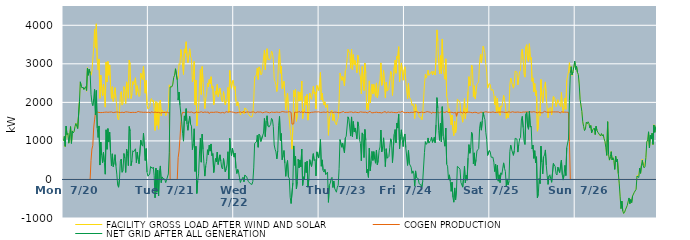
| Category | FACILITY GROSS LOAD AFTER WIND AND SOLAR | COGEN PRODUCTION | NET GRID AFTER ALL GENERATION |
|---|---|---|---|
|  Mon  7/20 | 998 | 0 | 1005 |
|  Mon  7/20 | 1118 | 0 | 1118 |
|  Mon  7/20 | 846 | 0 | 858 |
|  Mon  7/20 | 1331 | 0 | 1385 |
|  Mon  7/20 | 1161 | 0 | 1161 |
|  Mon  7/20 | 1197 | 0 | 1197 |
|  Mon  7/20 | 941 | 0 | 941 |
|  Mon  7/20 | 1137 | 0 | 1148 |
|  Mon  7/20 | 1372 | 0 | 1372 |
|  Mon  7/20 | 946 | 0 | 936 |
|  Mon  7/20 | 1258 | 0 | 1258 |
|  Mon  7/20 | 1210 | 0 | 1210 |
|  Mon  7/20 | 1243 | 0 | 1243 |
|  Mon  7/20 | 1370 | 0 | 1373 |
|  Mon  7/20 | 1465 | 0 | 1453 |
|  Mon  7/20 | 1448 | 0 | 1438 |
|  Mon  7/20 | 1326 | 0 | 1320 |
|  Mon  7/20 | 1316 | 0 | 1316 |
|  Mon  7/20 | 2018 | 0 | 2011 |
|  Mon  7/20 | 2528 | 0 | 2533 |
|  Mon  7/20 | 2423 | 0 | 2423 |
|  Mon  7/20 | 2381 | 0 | 2371 |
|  Mon  7/20 | 2398 | 0 | 2398 |
|  Mon  7/20 | 2338 | 0 | 2332 |
|  Mon  7/20 | 2364 | 0 | 2351 |
|  Mon  7/20 | 2409 | 0 | 2407 |
|  Mon  7/20 | 2288 | 0 | 2306 |
|  Mon  7/20 | 2899 | 0 | 2888 |
|  Mon  7/20 | 2703 | 0 | 2703 |
|  Mon  7/20 | 2860 | 0 | 2860 |
|  Mon  7/20 | 2764 | 0 | 2764 |
|  Mon  7/20 | 2703 | 491 | 2212 |
|  Mon  7/20 | 2797 | 788 | 1990 |
|  Mon  7/20 | 2812 | 880 | 1914 |
|  Mon  7/20 | 3420 | 1336 | 2084 |
|  Mon  7/20 | 3893 | 1545 | 2339 |
|  Mon  7/20 | 3408 | 1736 | 1672 |
|  Mon  7/20 | 4037 | 1729 | 2308 |
|  Mon  7/20 | 3083 | 1748 | 1335 |
|  Mon  7/20 | 2839 | 1750 | 1089 |
|  Mon  7/20 | 3126 | 1738 | 1388 |
|  Mon  7/20 | 2104 | 1730 | 374 |
|  Mon  7/20 | 2706 | 1735 | 971 |
|  Mon  7/20 | 2366 | 1742 | 624 |
|  Mon  7/20 | 2170 | 1737 | 433 |
|  Mon  7/20 | 2467 | 1747 | 703 |
|  Mon  7/20 | 2193 | 1742 | 451 |
|  Mon  7/20 | 1876 | 1740 | 136 |
|  Mon  7/20 | 3048 | 1748 | 1288 |
|  Mon  7/20 | 2528 | 1746 | 782 |
|  Mon  7/20 | 3062 | 1742 | 1320 |
|  Mon  7/20 | 2702 | 1732 | 970 |
|  Mon  7/20 | 2971 | 1746 | 1225 |
|  Mon  7/20 | 2433 | 1736 | 697 |
|  Mon  7/20 | 2102 | 1751 | 351 |
|  Mon  7/20 | 2406 | 1741 | 665 |
|  Mon  7/20 | 2026 | 1735 | 332 |
|  Mon  7/20 | 2190 | 1748 | 442 |
|  Mon  7/20 | 2382 | 1744 | 643 |
|  Mon  7/20 | 2103 | 1747 | 356 |
|  Mon  7/20 | 1888 | 1750 | 138 |
|  Mon  7/20 | 1587 | 1732 | -145 |
|  Mon  7/20 | 1542 | 1744 | -202 |
|  Mon  7/20 | 1724 | 1727 | -3 |
|  Mon  7/20 | 2209 | 1736 | 473 |
|  Mon  7/20 | 2277 | 1747 | 530 |
|  Mon  7/20 | 1929 | 1744 | 186 |
|  Mon  7/20 | 1974 | 1752 | 222 |
|  Mon  7/20 | 2408 | 1735 | 673 |
|  Mon  7/20 | 2279 | 1734 | 549 |
|  Mon  7/20 | 1967 | 1754 | 182 |
|  Mon  7/20 | 2532 | 1746 | 786 |
|  Mon  7/20 | 2413 | 1750 | 680 |
|  Mon  7/20 | 2107 | 1748 | 359 |
|  Mon  7/20 | 3096 | 1742 | 1373 |
|  Mon  7/20 | 2990 | 1736 | 1254 |
|  Mon  7/20 | 2098 | 1736 | 356 |
|  Mon  7/20 | 2221 | 1734 | 487 |
|  Mon  7/20 | 2540 | 1742 | 745 |
|  Mon  7/20 | 2463 | 1745 | 718 |
|  Mon  7/20 | 2459 | 1738 | 721 |
|  Mon  7/20 | 2639 | 1733 | 796 |
|  Mon  7/20 | 2188 | 1740 | 432 |
|  Mon  7/20 | 2432 | 1744 | 709 |
|  Mon  7/20 | 2281 | 1764 | 533 |
|  Mon  7/20 | 2149 | 1741 | 408 |
|  Mon  7/20 | 2183 | 1750 | 433 |
|  Mon  7/20 | 2756 | 1737 | 1019 |
|  Mon  7/20 | 2649 | 1747 | 902 |
|  Mon  7/20 | 2587 | 1742 | 864 |
|  Mon  7/20 | 2935 | 1741 | 1203 |
|  Mon  7/20 | 2950 | 1758 | 1209 |
|  Mon  7/20 | 2237 | 1745 | 492 |
|  Mon  7/20 | 2571 | 1747 | 802 |
|  Mon  7/20 | 1931 | 1740 | 191 |
|  Mon  7/20 | 1825 | 1741 | 84 |
|  Tue  7/21 | 1837 | 1745 | 92 |
|  Tue  7/21 | 1883 | 1757 | 141 |
|  Tue  7/21 | 2064 | 1724 | 335 |
|  Tue  7/21 | 2101 | 1758 | 359 |
|  Tue  7/21 | 2020 | 1733 | 287 |
|  Tue  7/21 | 2057 | 1737 | 320 |
|  Tue  7/21 | 1849 | 1739 | 110 |
|  Tue  7/21 | 1271 | 1747 | -476 |
|  Tue  7/21 | 2020 | 1742 | 294 |
|  Tue  7/21 | 1403 | 1739 | -333 |
|  Tue  7/21 | 1989 | 1754 | 243 |
|  Tue  7/21 | 1305 | 1740 | -429 |
|  Tue  7/21 | 1984 | 1755 | 229 |
|  Tue  7/21 | 2060 | 1724 | 351 |
|  Tue  7/21 | 1652 | 1733 | -81 |
|  Tue  7/21 | 1803 | 1737 | 66 |
|  Tue  7/21 | 1769 | 1741 | 28 |
|  Tue  7/21 | 1729 | 1735 | 5 |
|  Tue  7/21 | 1767 | 1752 | 4 |
|  Tue  7/21 | 1654 | 1741 | -82 |
|  Tue  7/21 | 1725 | 1732 | -7 |
|  Tue  7/21 | 1739 | 1750 | -10 |
|  Tue  7/21 | 1844 | 1721 | 142 |
|  Tue  7/21 | 2454 | 1749 | 695 |
|  Tue  7/21 | 2400 | 0 | 2400 |
|  Tue  7/21 | 2420 | 0 | 2413 |
|  Tue  7/21 | 2405 | 0 | 2405 |
|  Tue  7/21 | 2473 | 0 | 2473 |
|  Tue  7/21 | 2648 | 0 | 2648 |
|  Tue  7/21 | 2695 | 0 | 2704 |
|  Tue  7/21 | 2872 | 0 | 2872 |
|  Tue  7/21 | 2868 | 0 | 2868 |
|  Tue  7/21 | 2584 | 0 | 2584 |
|  Tue  7/21 | 2625 | 567 | 2058 |
|  Tue  7/21 | 3005 | 737 | 2268 |
|  Tue  7/21 | 2976 | 1041 | 1935 |
|  Tue  7/21 | 3372 | 1435 | 1936 |
|  Tue  7/21 | 3186 | 1675 | 1493 |
|  Tue  7/21 | 2941 | 1742 | 1199 |
|  Tue  7/21 | 2722 | 1729 | 993 |
|  Tue  7/21 | 3386 | 1737 | 1649 |
|  Tue  7/21 | 3276 | 1747 | 1529 |
|  Tue  7/21 | 3572 | 1730 | 1837 |
|  Tue  7/21 | 3180 | 1735 | 1437 |
|  Tue  7/21 | 3029 | 1753 | 1276 |
|  Tue  7/21 | 3252 | 1743 | 1509 |
|  Tue  7/21 | 3391 | 1741 | 1637 |
|  Tue  7/21 | 3183 | 1754 | 1429 |
|  Tue  7/21 | 3133 | 1751 | 1382 |
|  Tue  7/21 | 2536 | 1758 | 775 |
|  Tue  7/21 | 2664 | 1730 | 934 |
|  Tue  7/21 | 3061 | 1749 | 1315 |
|  Tue  7/21 | 1931 | 1724 | 207 |
|  Tue  7/21 | 2576 | 1753 | 860 |
|  Tue  7/21 | 1388 | 1756 | -364 |
|  Tue  7/21 | 1702 | 1740 | -38 |
|  Tue  7/21 | 1871 | 1726 | 145 |
|  Tue  7/21 | 2426 | 1741 | 685 |
|  Tue  7/21 | 2850 | 1733 | 1075 |
|  Tue  7/21 | 2204 | 1756 | 448 |
|  Tue  7/21 | 2929 | 1733 | 1175 |
|  Tue  7/21 | 2529 | 1737 | 780 |
|  Tue  7/21 | 2154 | 1735 | 411 |
|  Tue  7/21 | 1837 | 1750 | 87 |
|  Tue  7/21 | 2091 | 1737 | 354 |
|  Tue  7/21 | 2211 | 1743 | 468 |
|  Tue  7/21 | 2502 | 1731 | 771 |
|  Tue  7/21 | 2402 | 1750 | 639 |
|  Tue  7/21 | 2598 | 1710 | 888 |
|  Tue  7/21 | 2477 | 1742 | 735 |
|  Tue  7/21 | 2665 | 1744 | 921 |
|  Tue  7/21 | 2366 | 1743 | 619 |
|  Tue  7/21 | 2418 | 1761 | 670 |
|  Tue  7/21 | 1940 | 1740 | 180 |
|  Tue  7/21 | 2115 | 1749 | 366 |
|  Tue  7/21 | 2292 | 1748 | 544 |
|  Tue  7/21 | 2206 | 1733 | 456 |
|  Tue  7/21 | 2466 | 1748 | 711 |
|  Tue  7/21 | 2147 | 1742 | 388 |
|  Tue  7/21 | 2147 | 1736 | 411 |
|  Tue  7/21 | 2371 | 1732 | 639 |
|  Tue  7/21 | 2202 | 1726 | 476 |
|  Tue  7/21 | 2055 | 1739 | 304 |
|  Tue  7/21 | 2011 | 1740 | 271 |
|  Tue  7/21 | 2279 | 1743 | 543 |
|  Tue  7/21 | 2255 | 1724 | 522 |
|  Tue  7/21 | 1937 | 1738 | 199 |
|  Tue  7/21 | 2036 | 1757 | 279 |
|  Tue  7/21 | 2108 | 1749 | 397 |
|  Tue  7/21 | 2388 | 1745 | 719 |
|  Tue  7/21 | 1737 | 1744 | -7 |
|  Tue  7/21 | 2825 | 1758 | 1067 |
|  Tue  7/21 | 2500 | 1742 | 758 |
|  Tue  7/21 | 2367 | 1752 | 615 |
|  Tue  7/21 | 2551 | 1742 | 809 |
|  Tue  7/21 | 2579 | 1745 | 834 |
|  Wed  7/22 | 2337 | 1757 | 580 |
|  Wed  7/22 | 2412 | 1728 | 684 |
|  Wed  7/22 | 2033 | 1735 | 298 |
|  Wed  7/22 | 1906 | 1730 | 154 |
|  Wed  7/22 | 2015 | 1752 | 258 |
|  Wed  7/22 | 1923 | 1741 | 182 |
|  Wed  7/22 | 1786 | 1743 | 43 |
|  Wed  7/22 | 1671 | 1751 | -80 |
|  Wed  7/22 | 1729 | 1742 | -17 |
|  Wed  7/22 | 1715 | 1734 | -19 |
|  Wed  7/22 | 1776 | 1735 | 60 |
|  Wed  7/22 | 1703 | 1764 | -60 |
|  Wed  7/22 | 1852 | 1734 | 112 |
|  Wed  7/22 | 1860 | 1744 | 116 |
|  Wed  7/22 | 1822 | 1748 | 74 |
|  Wed  7/22 | 1766 | 1768 | -2 |
|  Wed  7/22 | 1698 | 1751 | -53 |
|  Wed  7/22 | 1709 | 1749 | -47 |
|  Wed  7/22 | 1633 | 1740 | -107 |
|  Wed  7/22 | 1624 | 1744 | -120 |
|  Wed  7/22 | 1619 | 1749 | -130 |
|  Wed  7/22 | 1700 | 1749 | -49 |
|  Wed  7/22 | 2058 | 1753 | 300 |
|  Wed  7/22 | 2664 | 1732 | 936 |
|  Wed  7/22 | 2677 | 1729 | 946 |
|  Wed  7/22 | 2700 | 1727 | 973 |
|  Wed  7/22 | 2893 | 1752 | 1146 |
|  Wed  7/22 | 2595 | 1743 | 835 |
|  Wed  7/22 | 2921 | 1747 | 1177 |
|  Wed  7/22 | 2882 | 1738 | 1144 |
|  Wed  7/22 | 2712 | 1750 | 983 |
|  Wed  7/22 | 2738 | 1746 | 997 |
|  Wed  7/22 | 2920 | 1729 | 1139 |
|  Wed  7/22 | 2941 | 1741 | 1203 |
|  Wed  7/22 | 3351 | 1743 | 1584 |
|  Wed  7/22 | 2848 | 1739 | 1112 |
|  Wed  7/22 | 3275 | 1754 | 1521 |
|  Wed  7/22 | 3393 | 1741 | 1652 |
|  Wed  7/22 | 3112 | 1740 | 1387 |
|  Wed  7/22 | 3098 | 1741 | 1357 |
|  Wed  7/22 | 3105 | 1728 | 1377 |
|  Wed  7/22 | 3160 | 1733 | 1427 |
|  Wed  7/22 | 3333 | 1748 | 1585 |
|  Wed  7/22 | 3286 | 1738 | 1555 |
|  Wed  7/22 | 3116 | 1741 | 1375 |
|  Wed  7/22 | 2618 | 1724 | 894 |
|  Wed  7/22 | 2541 | 1741 | 784 |
|  Wed  7/22 | 2452 | 1737 | 715 |
|  Wed  7/22 | 2282 | 1748 | 534 |
|  Wed  7/22 | 2520 | 1740 | 747 |
|  Wed  7/22 | 3147 | 1740 | 1407 |
|  Wed  7/22 | 3381 | 1745 | 1636 |
|  Wed  7/22 | 2756 | 1743 | 1012 |
|  Wed  7/22 | 2942 | 1750 | 1192 |
|  Wed  7/22 | 2356 | 1762 | 513 |
|  Wed  7/22 | 2363 | 1739 | 624 |
|  Wed  7/22 | 2544 | 1753 | 751 |
|  Wed  7/22 | 2162 | 1743 | 419 |
|  Wed  7/22 | 1802 | 1748 | 81 |
|  Wed  7/22 | 2127 | 1735 | 392 |
|  Wed  7/22 | 2242 | 1748 | 494 |
|  Wed  7/22 | 1802 | 1739 | 63 |
|  Wed  7/22 | 1794 | 1758 | 36 |
|  Wed  7/22 | 1297 | 1758 | -461 |
|  Wed  7/22 | 1119 | 1743 | -624 |
|  Wed  7/22 | 786 | 1435 | -649 |
|  Wed  7/22 | 1351 | 1449 | -92 |
|  Wed  7/22 | 2312 | 1442 | 870 |
|  Wed  7/22 | 2146 | 1748 | 366 |
|  Wed  7/22 | 2340 | 1735 | 605 |
|  Wed  7/22 | 1509 | 1739 | -248 |
|  Wed  7/22 | 1692 | 1734 | -52 |
|  Wed  7/22 | 2277 | 1751 | 526 |
|  Wed  7/22 | 2033 | 1733 | 300 |
|  Wed  7/22 | 2263 | 1756 | 507 |
|  Wed  7/22 | 2055 | 1729 | 326 |
|  Wed  7/22 | 2554 | 1762 | 790 |
|  Wed  7/22 | 1579 | 1733 | -154 |
|  Wed  7/22 | 1809 | 1740 | 69 |
|  Wed  7/22 | 1754 | 1749 | -9 |
|  Wed  7/22 | 2165 | 1743 | 445 |
|  Wed  7/22 | 1930 | 1735 | 178 |
|  Wed  7/22 | 2206 | 1733 | 473 |
|  Wed  7/22 | 1539 | 1739 | -202 |
|  Wed  7/22 | 1750 | 1730 | 20 |
|  Wed  7/22 | 2242 | 1729 | 514 |
|  Wed  7/22 | 2133 | 1729 | 404 |
|  Wed  7/22 | 2077 | 1743 | 334 |
|  Wed  7/22 | 2066 | 1729 | 330 |
|  Wed  7/22 | 2414 | 1745 | 669 |
|  Wed  7/22 | 2221 | 1731 | 490 |
|  Wed  7/22 | 2271 | 1753 | 517 |
|  Wed  7/22 | 1826 | 1728 | 91 |
|  Wed  7/22 | 2440 | 1750 | 716 |
|  Wed  7/22 | 2439 | 1726 | 730 |
|  Wed  7/22 | 2310 | 1755 | 555 |
|  Thu  7/23 | 2475 | 1743 | 738 |
|  Thu  7/23 | 2775 | 1737 | 1038 |
|  Thu  7/23 | 2064 | 1728 | 343 |
|  Thu  7/23 | 2238 | 1742 | 508 |
|  Thu  7/23 | 2017 | 1753 | 237 |
|  Thu  7/23 | 1930 | 1749 | 191 |
|  Thu  7/23 | 2016 | 1753 | 263 |
|  Thu  7/23 | 1867 | 1739 | 128 |
|  Thu  7/23 | 1890 | 1727 | 163 |
|  Thu  7/23 | 1947 | 1757 | 190 |
|  Thu  7/23 | 1146 | 1740 | -594 |
|  Thu  7/23 | 1583 | 1736 | -152 |
|  Thu  7/23 | 1648 | 1747 | -99 |
|  Thu  7/23 | 1767 | 1753 | 14 |
|  Thu  7/23 | 1799 | 1744 | 55 |
|  Thu  7/23 | 1529 | 1738 | -209 |
|  Thu  7/23 | 1701 | 1741 | -40 |
|  Thu  7/23 | 1515 | 1746 | -231 |
|  Thu  7/23 | 1537 | 1750 | -209 |
|  Thu  7/23 | 1413 | 1744 | -331 |
|  Thu  7/23 | 1548 | 1747 | -199 |
|  Thu  7/23 | 1586 | 1735 | -149 |
|  Thu  7/23 | 2034 | 1752 | 282 |
|  Thu  7/23 | 2763 | 1729 | 1034 |
|  Thu  7/23 | 2784 | 1744 | 1040 |
|  Thu  7/23 | 2573 | 1747 | 837 |
|  Thu  7/23 | 2670 | 1731 | 939 |
|  Thu  7/23 | 2548 | 1763 | 785 |
|  Thu  7/23 | 2424 | 1736 | 688 |
|  Thu  7/23 | 2823 | 1745 | 1075 |
|  Thu  7/23 | 2869 | 1741 | 1122 |
|  Thu  7/23 | 2849 | 1735 | 1114 |
|  Thu  7/23 | 3373 | 1740 | 1624 |
|  Thu  7/23 | 3313 | 1744 | 1562 |
|  Thu  7/23 | 3268 | 1748 | 1544 |
|  Thu  7/23 | 2882 | 1756 | 1126 |
|  Thu  7/23 | 3373 | 1751 | 1622 |
|  Thu  7/23 | 2844 | 1733 | 1111 |
|  Thu  7/23 | 3238 | 1734 | 1504 |
|  Thu  7/23 | 2981 | 1745 | 1236 |
|  Thu  7/23 | 3086 | 1750 | 1336 |
|  Thu  7/23 | 2947 | 1735 | 1211 |
|  Thu  7/23 | 2769 | 1738 | 1053 |
|  Thu  7/23 | 3224 | 1739 | 1494 |
|  Thu  7/23 | 3113 | 1735 | 1378 |
|  Thu  7/23 | 2775 | 1743 | 1032 |
|  Thu  7/23 | 2661 | 1754 | 934 |
|  Thu  7/23 | 2223 | 1738 | 485 |
|  Thu  7/23 | 2928 | 1746 | 1208 |
|  Thu  7/23 | 2905 | 1754 | 1151 |
|  Thu  7/23 | 2308 | 1743 | 568 |
|  Thu  7/23 | 3020 | 1738 | 1297 |
|  Thu  7/23 | 2758 | 1745 | 1013 |
|  Thu  7/23 | 1810 | 1750 | 174 |
|  Thu  7/23 | 1983 | 1724 | 259 |
|  Thu  7/23 | 1803 | 1750 | 53 |
|  Thu  7/23 | 2557 | 1745 | 812 |
|  Thu  7/23 | 1990 | 1766 | 224 |
|  Thu  7/23 | 2205 | 1734 | 471 |
|  Thu  7/23 | 2470 | 1743 | 727 |
|  Thu  7/23 | 2222 | 1729 | 493 |
|  Thu  7/23 | 2467 | 1745 | 722 |
|  Thu  7/23 | 2270 | 1739 | 531 |
|  Thu  7/23 | 2157 | 1730 | 421 |
|  Thu  7/23 | 2504 | 1745 | 759 |
|  Thu  7/23 | 2123 | 1735 | 382 |
|  Thu  7/23 | 2232 | 1735 | 497 |
|  Thu  7/23 | 2477 | 1724 | 753 |
|  Thu  7/23 | 2577 | 1735 | 842 |
|  Thu  7/23 | 3024 | 1741 | 1283 |
|  Thu  7/23 | 2442 | 1725 | 717 |
|  Thu  7/23 | 2598 | 1740 | 858 |
|  Thu  7/23 | 2834 | 1746 | 1080 |
|  Thu  7/23 | 2468 | 1748 | 720 |
|  Thu  7/23 | 2122 | 1761 | 332 |
|  Thu  7/23 | 2522 | 1725 | 797 |
|  Thu  7/23 | 2292 | 1742 | 550 |
|  Thu  7/23 | 2280 | 1753 | 527 |
|  Thu  7/23 | 2341 | 1741 | 596 |
|  Thu  7/23 | 2574 | 1738 | 834 |
|  Thu  7/23 | 2803 | 1727 | 1055 |
|  Thu  7/23 | 2730 | 1747 | 975 |
|  Thu  7/23 | 2180 | 1743 | 437 |
|  Thu  7/23 | 2159 | 1738 | 434 |
|  Thu  7/23 | 2911 | 1738 | 1173 |
|  Thu  7/23 | 3094 | 1735 | 1295 |
|  Thu  7/23 | 2755 | 1738 | 951 |
|  Thu  7/23 | 3196 | 1732 | 1465 |
|  Thu  7/23 | 3140 | 1746 | 1334 |
|  Thu  7/23 | 3443 | 1749 | 1694 |
|  Thu  7/23 | 2530 | 1732 | 798 |
|  Thu  7/23 | 2855 | 1743 | 1109 |
|  Thu  7/23 | 3023 | 1735 | 1288 |
|  Thu  7/23 | 2800 | 1768 | 1032 |
|  Thu  7/23 | 2574 | 1746 | 853 |
|  Thu  7/23 | 2839 | 1734 | 1100 |
|  Fri  7/24 | 2924 | 1744 | 1180 |
|  Fri  7/24 | 2559 | 1733 | 826 |
|  Fri  7/24 | 2537 | 1745 | 818 |
|  Fri  7/24 | 2094 | 1740 | 364 |
|  Fri  7/24 | 2491 | 1741 | 750 |
|  Fri  7/24 | 2142 | 1733 | 409 |
|  Fri  7/24 | 2149 | 1744 | 412 |
|  Fri  7/24 | 2060 | 1743 | 317 |
|  Fri  7/24 | 1920 | 1761 | 159 |
|  Fri  7/24 | 1960 | 1738 | 222 |
|  Fri  7/24 | 1878 | 1739 | 147 |
|  Fri  7/24 | 1580 | 1754 | -174 |
|  Fri  7/24 | 1958 | 1736 | 222 |
|  Fri  7/24 | 1786 | 1757 | 47 |
|  Fri  7/24 | 1798 | 1745 | 53 |
|  Fri  7/24 | 1766 | 1734 | 22 |
|  Fri  7/24 | 1621 | 1732 | -111 |
|  Fri  7/24 | 1645 | 1736 | -91 |
|  Fri  7/24 | 1608 | 1749 | -141 |
|  Fri  7/24 | 1548 | 1748 | -207 |
|  Fri  7/24 | 1700 | 1736 | -51 |
|  Fri  7/24 | 1688 | 1734 | -46 |
|  Fri  7/24 | 2471 | 1750 | 700 |
|  Fri  7/24 | 2729 | 1743 | 980 |
|  Fri  7/24 | 2630 | 1733 | 912 |
|  Fri  7/24 | 2700 | 1760 | 940 |
|  Fri  7/24 | 2834 | 1757 | 1077 |
|  Fri  7/24 | 2703 | 1749 | 943 |
|  Fri  7/24 | 2699 | 1739 | 960 |
|  Fri  7/24 | 2758 | 1742 | 1016 |
|  Fri  7/24 | 2804 | 1711 | 1093 |
|  Fri  7/24 | 2710 | 1748 | 962 |
|  Fri  7/24 | 2814 | 1743 | 1027 |
|  Fri  7/24 | 2826 | 1732 | 1094 |
|  Fri  7/24 | 2709 | 1756 | 953 |
|  Fri  7/24 | 3156 | 1738 | 1420 |
|  Fri  7/24 | 3880 | 1737 | 2123 |
|  Fri  7/24 | 3588 | 1748 | 1852 |
|  Fri  7/24 | 3010 | 1741 | 1269 |
|  Fri  7/24 | 2744 | 1731 | 1013 |
|  Fri  7/24 | 3212 | 1748 | 1457 |
|  Fri  7/24 | 2743 | 1761 | 974 |
|  Fri  7/24 | 3645 | 1757 | 1888 |
|  Fri  7/24 | 2880 | 1748 | 1129 |
|  Fri  7/24 | 2884 | 1732 | 1152 |
|  Fri  7/24 | 2599 | 1737 | 862 |
|  Fri  7/24 | 3129 | 1731 | 1333 |
|  Fri  7/24 | 2157 | 1762 | 395 |
|  Fri  7/24 | 2054 | 1746 | 345 |
|  Fri  7/24 | 1739 | 1737 | 2 |
|  Fri  7/24 | 1834 | 1740 | 119 |
|  Fri  7/24 | 1656 | 1743 | -46 |
|  Fri  7/24 | 1414 | 1740 | -309 |
|  Fri  7/24 | 1671 | 1742 | -71 |
|  Fri  7/24 | 1284 | 1748 | -464 |
|  Fri  7/24 | 1136 | 1726 | -590 |
|  Fri  7/24 | 1512 | 1732 | -220 |
|  Fri  7/24 | 1212 | 1742 | -530 |
|  Fri  7/24 | 1363 | 1640 | -277 |
|  Fri  7/24 | 2082 | 1742 | 340 |
|  Fri  7/24 | 2091 | 1734 | 357 |
|  Fri  7/24 | 2038 | 1740 | 298 |
|  Fri  7/24 | 1988 | 1727 | 261 |
|  Fri  7/24 | 1671 | 1749 | -78 |
|  Fri  7/24 | 1630 | 1732 | -102 |
|  Fri  7/24 | 1485 | 1720 | -200 |
|  Fri  7/24 | 1806 | 1755 | 51 |
|  Fri  7/24 | 2098 | 1755 | 343 |
|  Fri  7/24 | 1573 | 1723 | -88 |
|  Fri  7/24 | 1843 | 1730 | 113 |
|  Fri  7/24 | 1724 | 1743 | -19 |
|  Fri  7/24 | 2283 | 1729 | 554 |
|  Fri  7/24 | 2667 | 1749 | 904 |
|  Fri  7/24 | 2424 | 1744 | 680 |
|  Fri  7/24 | 2563 | 1739 | 823 |
|  Fri  7/24 | 2968 | 1746 | 1222 |
|  Fri  7/24 | 2883 | 1730 | 1153 |
|  Fri  7/24 | 2141 | 1736 | 407 |
|  Fri  7/24 | 2431 | 1741 | 690 |
|  Fri  7/24 | 2097 | 1737 | 360 |
|  Fri  7/24 | 2279 | 1742 | 519 |
|  Fri  7/24 | 2467 | 1728 | 739 |
|  Fri  7/24 | 2497 | 1721 | 771 |
|  Fri  7/24 | 2548 | 1739 | 803 |
|  Fri  7/24 | 3055 | 1723 | 1332 |
|  Fri  7/24 | 3242 | 1749 | 1493 |
|  Fri  7/24 | 3025 | 1746 | 1279 |
|  Fri  7/24 | 3267 | 1740 | 1523 |
|  Fri  7/24 | 3459 | 1732 | 1740 |
|  Fri  7/24 | 3372 | 1742 | 1630 |
|  Fri  7/24 | 3289 | 1737 | 1552 |
|  Fri  7/24 | 2978 | 1757 | 1221 |
|  Fri  7/24 | 2791 | 1756 | 1041 |
|  Fri  7/24 | 2367 | 1745 | 622 |
|  Fri  7/24 | 2356 | 1735 | 621 |
|  Fri  7/24 | 2489 | 1744 | 752 |
|  Sat  7/25 | 2459 | 1740 | 711 |
|  Sat  7/25 | 2318 | 1741 | 577 |
|  Sat  7/25 | 2296 | 1744 | 552 |
|  Sat  7/25 | 2328 | 1753 | 575 |
|  Sat  7/25 | 2205 | 1757 | 448 |
|  Sat  7/25 | 1943 | 1738 | 205 |
|  Sat  7/25 | 2156 | 1756 | 400 |
|  Sat  7/25 | 1747 | 1740 | 7 |
|  Sat  7/25 | 2109 | 1752 | 365 |
|  Sat  7/25 | 1720 | 1748 | -44 |
|  Sat  7/25 | 1868 | 1749 | 120 |
|  Sat  7/25 | 1666 | 1747 | -81 |
|  Sat  7/25 | 1909 | 1728 | 172 |
|  Sat  7/25 | 1880 | 1752 | 128 |
|  Sat  7/25 | 1865 | 1743 | 122 |
|  Sat  7/25 | 2180 | 1746 | 430 |
|  Sat  7/25 | 2043 | 1742 | 290 |
|  Sat  7/25 | 1953 | 1738 | 207 |
|  Sat  7/25 | 1577 | 1750 | -173 |
|  Sat  7/25 | 1755 | 1741 | 14 |
|  Sat  7/25 | 1604 | 1743 | -139 |
|  Sat  7/25 | 1703 | 1755 | -52 |
|  Sat  7/25 | 2463 | 1739 | 724 |
|  Sat  7/25 | 2628 | 1740 | 888 |
|  Sat  7/25 | 2528 | 1749 | 779 |
|  Sat  7/25 | 2524 | 1757 | 767 |
|  Sat  7/25 | 2369 | 1744 | 625 |
|  Sat  7/25 | 2482 | 1744 | 743 |
|  Sat  7/25 | 2810 | 1741 | 1069 |
|  Sat  7/25 | 2789 | 1744 | 1051 |
|  Sat  7/25 | 2786 | 1740 | 1046 |
|  Sat  7/25 | 2455 | 1750 | 710 |
|  Sat  7/25 | 2641 | 1737 | 904 |
|  Sat  7/25 | 2796 | 1742 | 1054 |
|  Sat  7/25 | 2833 | 1749 | 1084 |
|  Sat  7/25 | 3282 | 1738 | 1544 |
|  Sat  7/25 | 3383 | 1747 | 1636 |
|  Sat  7/25 | 3106 | 1750 | 1345 |
|  Sat  7/25 | 2732 | 1735 | 991 |
|  Sat  7/25 | 2654 | 1746 | 908 |
|  Sat  7/25 | 3439 | 1741 | 1693 |
|  Sat  7/25 | 3497 | 1755 | 1742 |
|  Sat  7/25 | 3101 | 1731 | 1370 |
|  Sat  7/25 | 3052 | 1746 | 1301 |
|  Sat  7/25 | 3520 | 1747 | 1773 |
|  Sat  7/25 | 3112 | 1753 | 1358 |
|  Sat  7/25 | 3163 | 1752 | 1384 |
|  Sat  7/25 | 2546 | 1748 | 792 |
|  Sat  7/25 | 2635 | 1745 | 890 |
|  Sat  7/25 | 2278 | 1758 | 547 |
|  Sat  7/25 | 2489 | 1742 | 747 |
|  Sat  7/25 | 2176 | 1745 | 431 |
|  Sat  7/25 | 2301 | 1761 | 589 |
|  Sat  7/25 | 1253 | 1729 | -476 |
|  Sat  7/25 | 1363 | 1744 | -381 |
|  Sat  7/25 | 1773 | 1749 | 24 |
|  Sat  7/25 | 1656 | 1763 | -107 |
|  Sat  7/25 | 2593 | 1728 | 865 |
|  Sat  7/25 | 2193 | 1741 | 452 |
|  Sat  7/25 | 1993 | 1734 | 145 |
|  Sat  7/25 | 2337 | 1735 | 588 |
|  Sat  7/25 | 2404 | 1768 | 636 |
|  Sat  7/25 | 2530 | 1750 | 766 |
|  Sat  7/25 | 2113 | 1746 | 367 |
|  Sat  7/25 | 1830 | 1748 | 99 |
|  Sat  7/25 | 1604 | 1743 | -128 |
|  Sat  7/25 | 1844 | 1754 | 90 |
|  Sat  7/25 | 1849 | 1744 | 121 |
|  Sat  7/25 | 1866 | 1732 | 121 |
|  Sat  7/25 | 1676 | 1750 | -74 |
|  Sat  7/25 | 1662 | 1759 | -88 |
|  Sat  7/25 | 2153 | 1752 | 417 |
|  Sat  7/25 | 2126 | 1751 | 375 |
|  Sat  7/25 | 2066 | 1752 | 336 |
|  Sat  7/25 | 1890 | 1736 | 151 |
|  Sat  7/25 | 1868 | 1752 | 116 |
|  Sat  7/25 | 2069 | 1747 | 320 |
|  Sat  7/25 | 2051 | 1751 | 300 |
|  Sat  7/25 | 1938 | 1751 | 179 |
|  Sat  7/25 | 1893 | 1723 | 170 |
|  Sat  7/25 | 2258 | 1757 | 501 |
|  Sat  7/25 | 1870 | 1750 | 120 |
|  Sat  7/25 | 1729 | 1745 | -16 |
|  Sat  7/25 | 1896 | 1750 | 130 |
|  Sat  7/25 | 2112 | 1747 | 365 |
|  Sat  7/25 | 1821 | 1741 | 101 |
|  Sat  7/25 | 2571 | 1744 | 827 |
|  Sat  7/25 | 2554 | 1743 | 811 |
|  Sat  7/25 | 2791 | 1742 | 1049 |
|  Sat  7/25 | 3028 | 985 | 2042 |
|  Sat  7/25 | 2762 | 0 | 2752 |
|  Sat  7/25 | 2925 | 0 | 2925 |
|  Sat  7/25 | 2701 | 0 | 2713 |
|  Sat  7/25 | 2794 | 0 | 2789 |
|  Sat  7/25 | 2805 | 0 | 2806 |
|  Sat  7/25 | 3049 | 0 | 3069 |
|  Sun  7/26 | 2867 | 0 | 2856 |
|  Sun  7/26 | 2933 | 0 | 2937 |
|  Sun  7/26 | 2777 | 0 | 2781 |
|  Sun  7/26 | 2724 | 0 | 2724 |
|  Sun  7/26 | 2505 | 0 | 2477 |
|  Sun  7/26 | 2078 | 0 | 2081 |
|  Sun  7/26 | 2069 | 0 | 2076 |
|  Sun  7/26 | 1763 | 0 | 1762 |
|  Sun  7/26 | 1494 | 0 | 1495 |
|  Sun  7/26 | 1373 | 0 | 1373 |
|  Sun  7/26 | 1277 | 0 | 1267 |
|  Sun  7/26 | 1310 | 0 | 1310 |
|  Sun  7/26 | 1484 | 0 | 1487 |
|  Sun  7/26 | 1443 | 0 | 1444 |
|  Sun  7/26 | 1494 | 0 | 1496 |
|  Sun  7/26 | 1448 | 0 | 1448 |
|  Sun  7/26 | 1339 | 0 | 1333 |
|  Sun  7/26 | 1401 | 0 | 1401 |
|  Sun  7/26 | 1212 | 0 | 1211 |
|  Sun  7/26 | 1282 | 0 | 1282 |
|  Sun  7/26 | 1273 | 0 | 1277 |
|  Sun  7/26 | 1334 | 0 | 1334 |
|  Sun  7/26 | 1165 | 0 | 1165 |
|  Sun  7/26 | 1380 | 0 | 1380 |
|  Sun  7/26 | 1270 | 0 | 1270 |
|  Sun  7/26 | 1215 | 0 | 1226 |
|  Sun  7/26 | 1228 | 0 | 1228 |
|  Sun  7/26 | 1156 | 0 | 1156 |
|  Sun  7/26 | 1119 | 0 | 1130 |
|  Sun  7/26 | 1186 | 0 | 1190 |
|  Sun  7/26 | 1129 | 0 | 1129 |
|  Sun  7/26 | 1167 | 0 | 1165 |
|  Sun  7/26 | 1056 | 0 | 1056 |
|  Sun  7/26 | 985 | 0 | 988 |
|  Sun  7/26 | 820 | 0 | 820 |
|  Sun  7/26 | 624 | 0 | 624 |
|  Sun  7/26 | 1498 | 0 | 1498 |
|  Sun  7/26 | 650 | 0 | 650 |
|  Sun  7/26 | 502 | 0 | 502 |
|  Sun  7/26 | 587 | 0 | 587 |
|  Sun  7/26 | 723 | 0 | 720 |
|  Sun  7/26 | 506 | 0 | 506 |
|  Sun  7/26 | 562 | 0 | 562 |
|  Sun  7/26 | 493 | 0 | 493 |
|  Sun  7/26 | 271 | 0 | 261 |
|  Sun  7/26 | 604 | 0 | 604 |
|  Sun  7/26 | 453 | 0 | 453 |
|  Sun  7/26 | 517 | 0 | 521 |
|  Sun  7/26 | 151 | 0 | 151 |
|  Sun  7/26 | -95 | 0 | -95 |
|  Sun  7/26 | -434 | 0 | -434 |
|  Sun  7/26 | -758 | 0 | -758 |
|  Sun  7/26 | -563 | 0 | -563 |
|  Sun  7/26 | -815 | 0 | -815 |
|  Sun  7/26 | -885 | 0 | -882 |
|  Sun  7/26 | -853 | 0 | -853 |
|  Sun  7/26 | -788 | 0 | -788 |
|  Sun  7/26 | -811 | 0 | -810 |
|  Sun  7/26 | -675 | 0 | -675 |
|  Sun  7/26 | -693 | 0 | -693 |
|  Sun  7/26 | -496 | 0 | -480 |
|  Sun  7/26 | -627 | 0 | -627 |
|  Sun  7/26 | -520 | 0 | -520 |
|  Sun  7/26 | -591 | 0 | -599 |
|  Sun  7/26 | -427 | 0 | -431 |
|  Sun  7/26 | -434 | 0 | -434 |
|  Sun  7/26 | -332 | 0 | -332 |
|  Sun  7/26 | -310 | 0 | -310 |
|  Sun  7/26 | -254 | 0 | -256 |
|  Sun  7/26 | 100 | 0 | 89 |
|  Sun  7/26 | 109 | 0 | 102 |
|  Sun  7/26 | 109 | 0 | 52 |
|  Sun  7/26 | 294 | 0 | 295 |
|  Sun  7/26 | 159 | 0 | 159 |
|  Sun  7/26 | 365 | 0 | 367 |
|  Sun  7/26 | 530 | 0 | 496 |
|  Sun  7/26 | 362 | 0 | 362 |
|  Sun  7/26 | 312 | 0 | 302 |
|  Sun  7/26 | 327 | 0 | 334 |
|  Sun  7/26 | 549 | 0 | 568 |
|  Sun  7/26 | 960 | 0 | 973 |
|  Sun  7/26 | 1022 | 0 | 1027 |
|  Sun  7/26 | 1221 | 0 | 1236 |
|  Sun  7/26 | 831 | 0 | 816 |
|  Sun  7/26 | 1149 | 0 | 1149 |
|  Sun  7/26 | 1062 | 0 | 1053 |
|  Sun  7/26 | 1198 | 0 | 1198 |
|  Sun  7/26 | 901 | 0 | 909 |
|  Sun  7/26 | 1418 | 0 | 1411 |
|  Sun  7/26 | 1230 | 0 | 1222 |
|  Sun  7/26 | 1356 | 0 | 1356 |
|  Sun  7/26 | 1418 | 0 | 1421 |